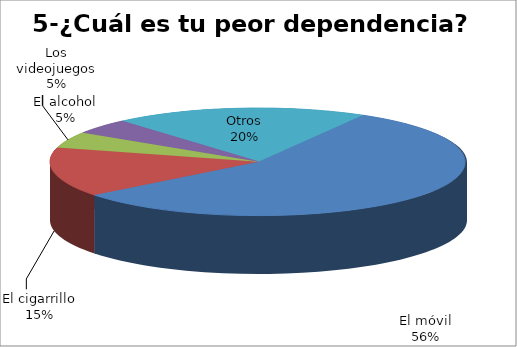
| Category | Series 0 |
|---|---|
| El móvil | 185 |
| El cigarrillo | 49 |
| Los videojuegos | 16 |
| El alcohol | 15 |
| Otros | 65 |